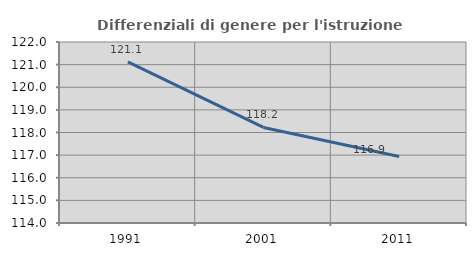
| Category | Differenziali di genere per l'istruzione superiore |
|---|---|
| 1991.0 | 121.124 |
| 2001.0 | 118.224 |
| 2011.0 | 116.943 |